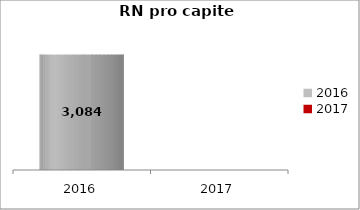
| Category | RN pro capite BG |
|---|---|
| 2016.0 | 3083.883 |
| 2017.0 | 0 |